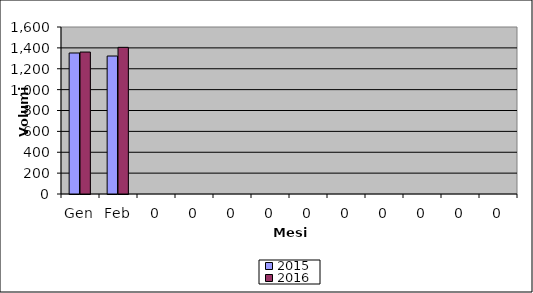
| Category | 2015 | 2016 |
|---|---|---|
| Gen | 1351 | 1360 |
| Feb | 1322 | 1405 |
| 0 | 0 | 0 |
| 0 | 0 | 0 |
| 0 | 0 | 0 |
| 0 | 0 | 0 |
| 0 | 0 | 0 |
| 0 | 0 | 0 |
| 0 | 0 | 0 |
| 0 | 0 | 0 |
| 0 | 0 | 0 |
| 0 | 0 | 0 |